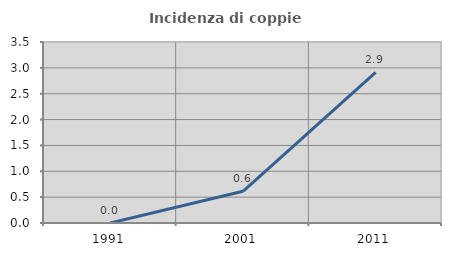
| Category | Incidenza di coppie miste |
|---|---|
| 1991.0 | 0 |
| 2001.0 | 0.613 |
| 2011.0 | 2.911 |